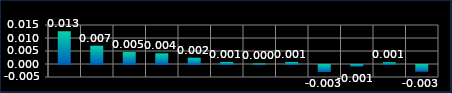
| Category | Series 0 |
|---|---|
| 0 | 0.013 |
| 1 | 0.007 |
| 2 | 0.005 |
| 3 | 0.004 |
| 4 | 0.002 |
| 5 | 0.001 |
| 6 | 0 |
| 7 | 0.001 |
| 8 | -0.003 |
| 9 | -0.001 |
| 10 | 0.001 |
| 11 | -0.003 |